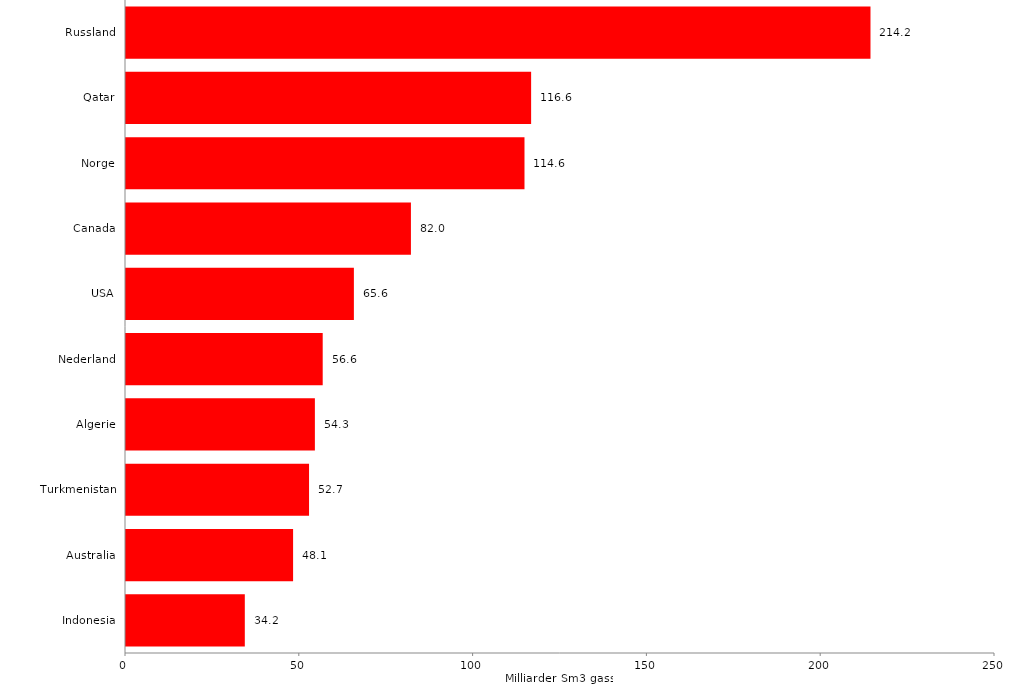
| Category |  34,2  |
|---|---|
| Indonesia | 34.18 |
| Australia | 48.07 |
| Turkmenistan | 52.66 |
| Algerie | 54.34 |
| Nederland | 56.59 |
| USA | 65.56 |
| Canada | 81.97 |
| Norge | 114.64 |
| Qatar | 116.55 |
| Russland | 214.18 |